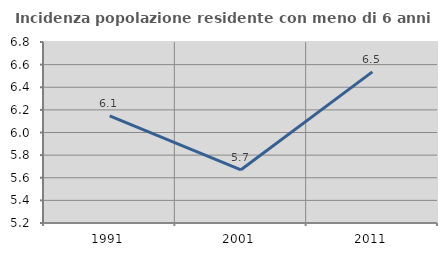
| Category | Incidenza popolazione residente con meno di 6 anni |
|---|---|
| 1991.0 | 6.148 |
| 2001.0 | 5.67 |
| 2011.0 | 6.536 |